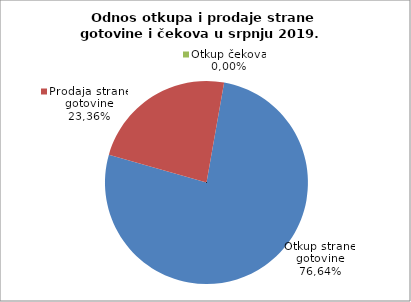
| Category | Otkup strane gotovine |
|---|---|
| 0 | 76.637 |
| 1 | 23.363 |
| 2 | 0 |